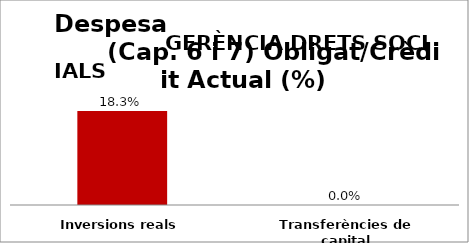
| Category | Series 0 |
|---|---|
| Inversions reals | 0.183 |
| Transferències de capital | 0 |